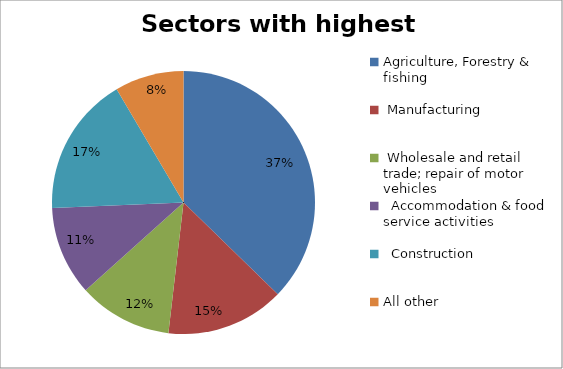
| Category | Sectors with highest totals | Percentage |
|---|---|---|
| Agriculture, Forestry & fishing | 34560 | 0.373 |
|  Manufacturing | 13492 | 0.146 |
|  Wholesale and retail trade; repair of motor vehicles  | 10681 | 0.115 |
|   Accommodation & food service activities | 10166 | 0.11 |
|   Construction | 15940 | 0.172 |
| All other | 7864 | 0.085 |